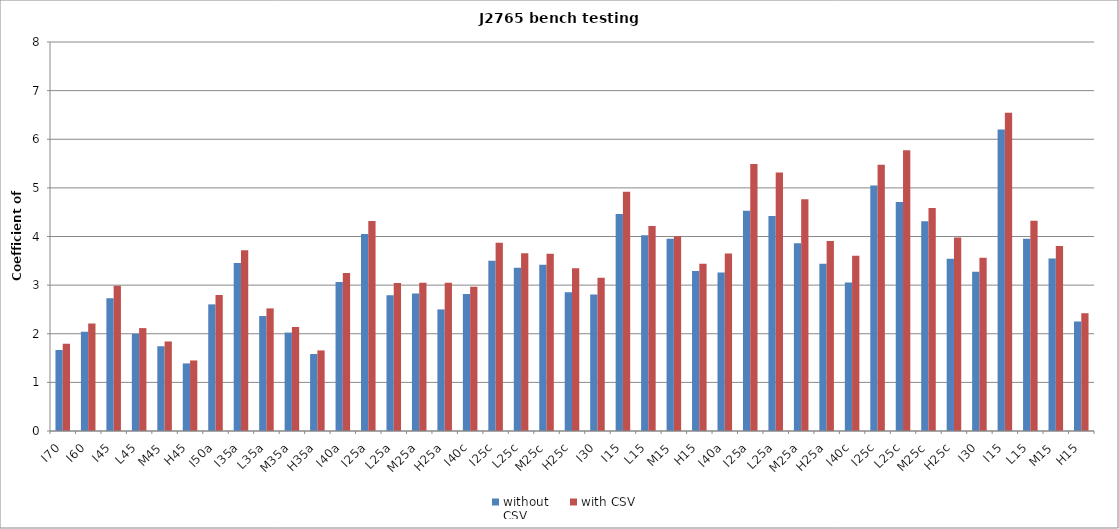
| Category | without 
CSV | with CSV |
|---|---|---|
| I70 | 1.666 | 1.793 |
| I60 | 2.042 | 2.211 |
| I45 | 2.728 | 2.989 |
| L45 | 2 | 2.116 |
| M45 | 1.743 | 1.841 |
| H45 | 1.39 | 1.451 |
| I50a | 2.604 | 2.794 |
| I35a | 3.452 | 3.716 |
| L35a | 2.364 | 2.521 |
| M35a | 2.024 | 2.14 |
| H35a | 1.584 | 1.658 |
| I40a | 3.063 | 3.251 |
| I25a | 4.05 | 4.318 |
| L25a | 2.792 | 3.046 |
| M25a | 2.825 | 3.049 |
| H25a | 2.5 | 3.051 |
| I40c | 2.819 | 2.966 |
| I25c | 3.501 | 3.874 |
| L25c | 3.358 | 3.656 |
| M25c | 3.417 | 3.647 |
| H25c | 2.853 | 3.348 |
| I30 | 2.81 | 3.15 |
| I15 | 4.465 | 4.92 |
| L15 | 4.027 | 4.216 |
| M15 | 3.955 | 4.007 |
| H15 | 3.291 | 3.441 |
| I40a | 3.261 | 3.652 |
| I25a | 4.529 | 5.489 |
| L25a | 4.423 | 5.315 |
| M25a | 3.862 | 4.765 |
| H25a | 3.44 | 3.91 |
| I40c | 3.055 | 3.604 |
| I25c | 5.051 | 5.477 |
| L25c | 4.711 | 5.772 |
| M25c | 4.316 | 4.585 |
| H25c | 3.542 | 3.978 |
| I30 | 3.273 | 3.563 |
| I15 | 6.199 | 6.547 |
| L15 | 3.955 | 4.325 |
| M15 | 3.549 | 3.803 |
| H15 | 2.251 | 2.422 |